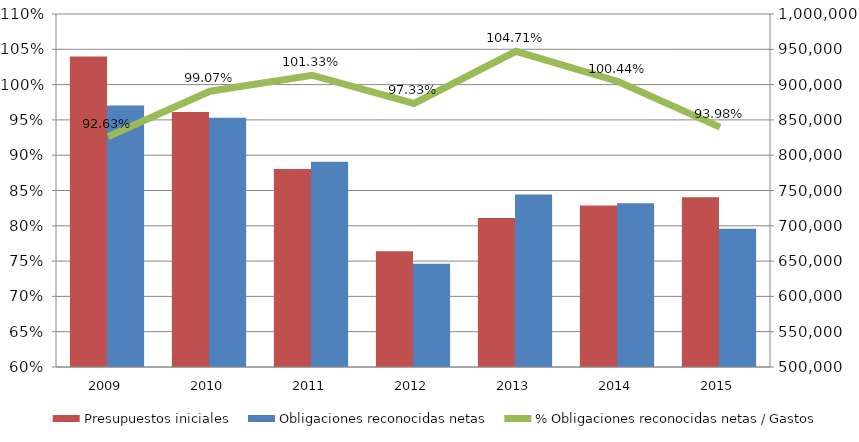
| Category | Presupuestos iniciales | Obligaciones reconocidas netas |
|---|---|---|
| 2009.0 | 939676.058 | 870419.188 |
| 2010.0 | 861041.347 | 853013.717 |
| 2011.0 | 780284.157 | 790656.119 |
| 2012.0 | 663839.162 | 646103.913 |
| 2013.0 | 710893.242 | 744398.393 |
| 2014.0 | 728748.257 | 731935.083 |
| 2015.0 | 740573.085 | 695990.213 |